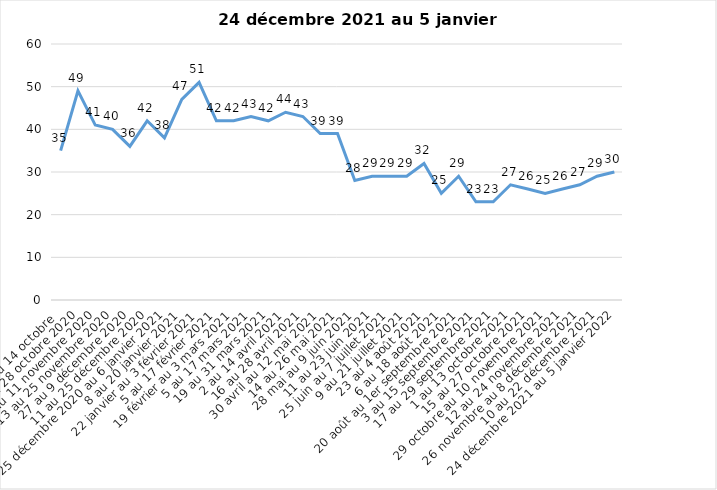
| Category | Toujours aux trois mesures |
|---|---|
| 2 au 14 octobre  | 35 |
| 16 au 28 octobre 2020 | 49 |
| 30 octobre au 11 novembre 2020 | 41 |
| 13 au 25 novembre 2020 | 40 |
| 27 au 9 décembre 2020 | 36 |
| 11 au 25 décembre 2020 | 42 |
| 25 décembre 2020 au 6 janvier 2021 | 38 |
| 8 au 20 janvier 2021 | 47 |
| 22 janvier au 3 février 2021 | 51 |
| 5 au 17 février 2021 | 42 |
| 19 février au 3 mars 2021 | 42 |
| 5 au 17 mars 2021 | 43 |
| 19 au 31 mars 2021 | 42 |
| 2 au 14 avril 2021 | 44 |
| 16 au 28 avril 2021 | 43 |
| 30 avril au 12 mai 2021 | 39 |
| 14 au 26 mai 2021 | 39 |
| 28 mai au 9 juin 2021 | 28 |
| 11 au 23 juin 2021 | 29 |
| 25 juin au 7 juillet 2021 | 29 |
| 9 au 21 juillet 2021 | 29 |
| 23 au 4 août 2021 | 32 |
| 6 au 18 août 2021 | 25 |
| 20 août au 1er septembre 2021 | 29 |
| 3 au 15 septembre 2021 | 23 |
| 17 au 29 septembre 2021 | 23 |
| 1 au 13 octobre 2021 | 27 |
| 15 au 27 octobre 2021 | 26 |
| 29 octobre au 10 novembre 2021 | 25 |
| 12 au 24 novembre 2021 | 26 |
| 26 novembre au 8 décembre 2021 | 27 |
| 10 au 22 décembre 2021 | 29 |
| 24 décembre 2021 au 5 janvier 2022 | 30 |